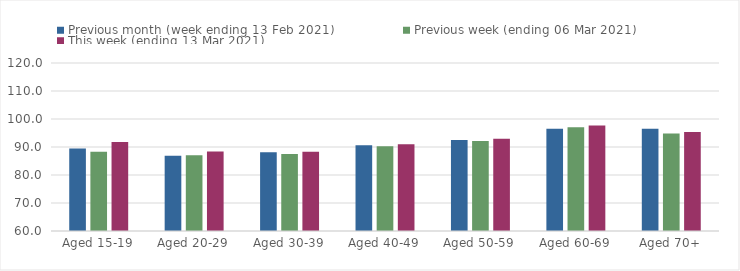
| Category | Previous month (week ending 13 Feb 2021) | Previous week (ending 06 Mar 2021) | This week (ending 13 Mar 2021) |
|---|---|---|---|
| Aged 15-19 | 89.44 | 88.27 | 91.78 |
| Aged 20-29 | 86.87 | 87.08 | 88.35 |
| Aged 30-39 | 88.14 | 87.51 | 88.29 |
| Aged 40-49 | 90.66 | 90.3 | 90.96 |
| Aged 50-59 | 92.52 | 92.17 | 92.95 |
| Aged 60-69 | 96.52 | 97.04 | 97.7 |
| Aged 70+ | 96.55 | 94.81 | 95.39 |